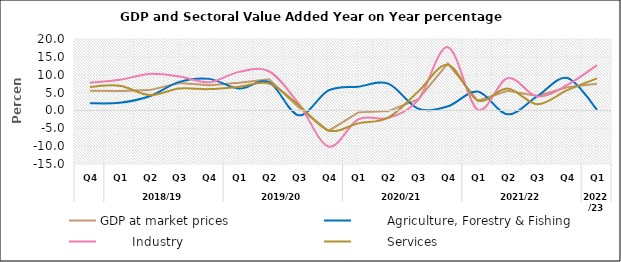
| Category | GDP at market prices |         Agriculture, Forestry & Fishing |         Industry |         Services |
|---|---|---|---|---|
| 0 | 5.492 | 2 | 7.741 | 6.593 |
| 1 | 5.458 | 2.149 | 8.581 | 6.923 |
| 2 | 5.686 | 3.972 | 10.222 | 4.308 |
| 3 | 7.697 | 7.991 | 9.501 | 6.147 |
| 4 | 7.025 | 8.836 | 7.875 | 5.969 |
| 5 | 7.744 | 6.111 | 10.791 | 6.607 |
| 6 | 8.683 | 7.915 | 10.97 | 7.531 |
| 7 | 0.891 | -1.353 | 1.899 | 1.512 |
| 8 | -5.742 | 5.597 | -10.098 | -5.598 |
| 9 | -0.543 | 6.657 | -2.473 | -3.619 |
| 10 | -0.193 | 7.512 | -2.074 | -2.015 |
| 11 | 3.061 | 0.511 | 2.932 | 5.248 |
| 12 | 13.192 | 1.154 | 17.717 | 12.751 |
| 13 | 2.707 | 5.288 | 0.189 | 2.82 |
| 14 | 5.489 | -1.092 | 9.015 | 6.148 |
| 15 | 4.035 | 4.007 | 3.928 | 1.732 |
| 16 | 6.47 | 9.059 | 7.125 | 5.667 |
| 17 | 7.477 | 0.203 | 12.703 | 8.967 |